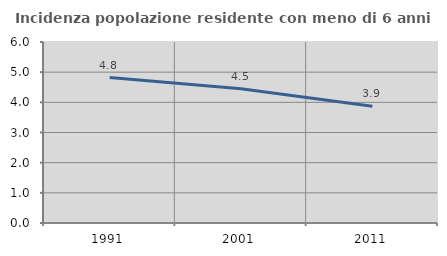
| Category | Incidenza popolazione residente con meno di 6 anni |
|---|---|
| 1991.0 | 4.819 |
| 2001.0 | 4.451 |
| 2011.0 | 3.871 |